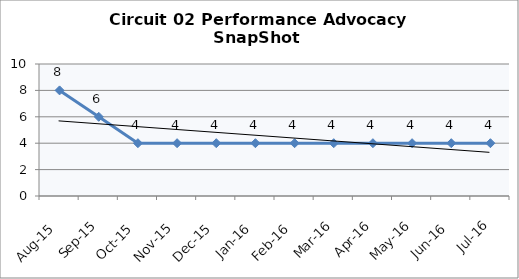
| Category | Circuit 02 |
|---|---|
| Aug-15 | 8 |
| Sep-15 | 6 |
| Oct-15 | 4 |
| Nov-15 | 4 |
| Dec-15 | 4 |
| Jan-16 | 4 |
| Feb-16 | 4 |
| Mar-16 | 4 |
| Apr-16 | 4 |
| May-16 | 4 |
| Jun-16 | 4 |
| Jul-16 | 4 |